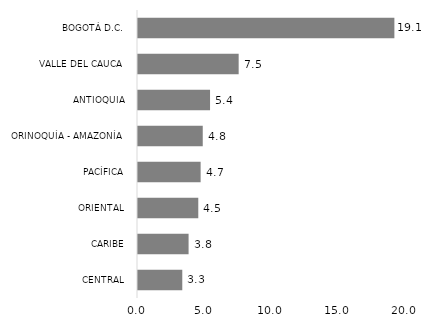
| Category | Series 0 |
|---|---|
| CENTRAL | 3.305 |
| CARIBE | 3.775 |
| ORIENTAL | 4.499 |
| PACÍFICA | 4.673 |
| ORINOQUÍA - AMAZONÍA | 4.832 |
| ANTIOQUIA | 5.377 |
| VALLE DEL CAUCA | 7.512 |
| BOGOTÁ D.C. | 19.133 |